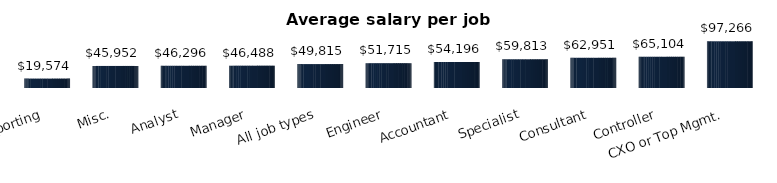
| Category | Average salary per job type |
|---|---|
| Reporting | 19574.159 |
| Misc. | 45952.334 |
| Analyst | 46295.769 |
| Manager | 46488.241 |
| All job types | 49814.598 |
| Engineer | 51715.151 |
| Accountant | 54196.441 |
| Specialist | 59812.969 |
| Consultant | 62950.733 |
| Controller | 65103.929 |
| CXO or Top Mgmt. | 97265.876 |